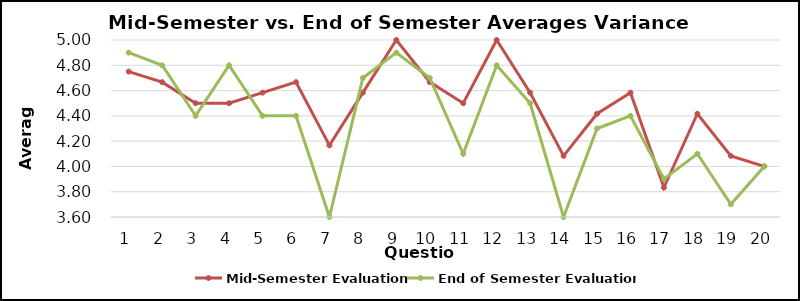
| Category | Mid-Semester Evaluation | End of Semester Evaluation |
|---|---|---|
| 0 | 4.75 | 4.9 |
| 1 | 4.667 | 4.8 |
| 2 | 4.5 | 4.4 |
| 3 | 4.5 | 4.8 |
| 4 | 4.583 | 4.4 |
| 5 | 4.667 | 4.4 |
| 6 | 4.167 | 3.6 |
| 7 | 4.583 | 4.7 |
| 8 | 5 | 4.9 |
| 9 | 4.667 | 4.7 |
| 10 | 4.5 | 4.1 |
| 11 | 5 | 4.8 |
| 12 | 4.583 | 4.5 |
| 13 | 4.083 | 3.6 |
| 14 | 4.417 | 4.3 |
| 15 | 4.583 | 4.4 |
| 16 | 3.833 | 3.9 |
| 17 | 4.417 | 4.1 |
| 18 | 4.083 | 3.7 |
| 19 | 4 | 4 |